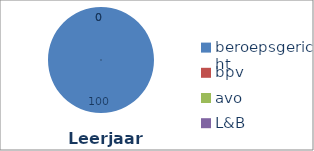
| Category | Series 0 |
|---|---|
| beroepsgericht | 100 |
| bpv | 0 |
| avo | 0 |
| L&B | 0 |